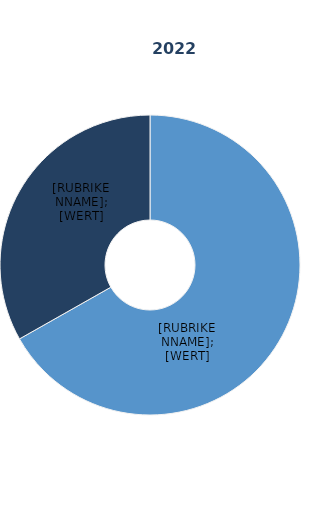
| Category | Series 1 |
|---|---|
| Vollzeitbeschäftigte | 66.8 |
| Teilzeitbeschäftigte | 33.2 |